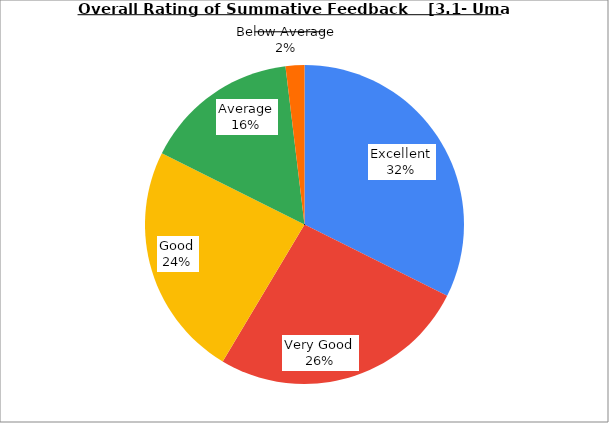
| Category | Series 0 |
|---|---|
| Excellent | 32.381 |
| Very Good | 26.19 |
| Good | 23.81 |
| Average | 15.714 |
| Below Average | 1.905 |